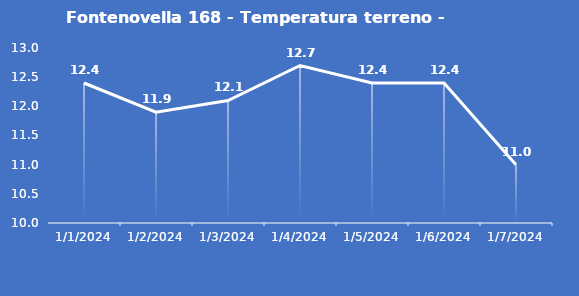
| Category | Fontenovella 168 - Temperatura terreno - Grezzo (°C) |
|---|---|
| 1/1/24 | 12.4 |
| 1/2/24 | 11.9 |
| 1/3/24 | 12.1 |
| 1/4/24 | 12.7 |
| 1/5/24 | 12.4 |
| 1/6/24 | 12.4 |
| 1/7/24 | 11 |